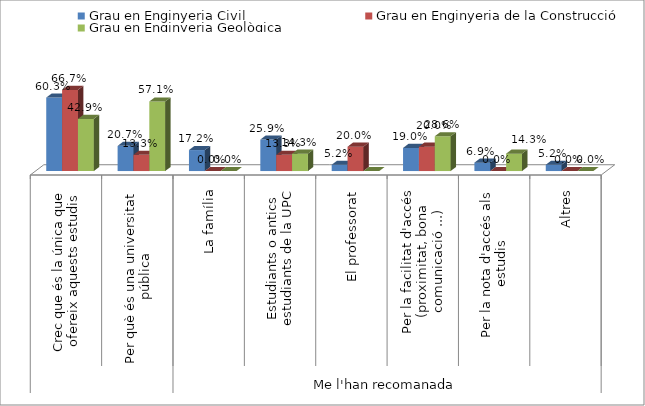
| Category | Grau en Enginyeria Civil | Grau en Enginyeria de la Construcció | Grau en Enginyeria Geològica |
|---|---|---|---|
| 0 | 0.603 | 0.667 | 0.429 |
| 1 | 0.207 | 0.133 | 0.571 |
| 2 | 0.172 | 0 | 0 |
| 3 | 0.259 | 0.133 | 0.143 |
| 4 | 0.052 | 0.2 | 0 |
| 5 | 0.19 | 0.2 | 0.286 |
| 6 | 0.069 | 0 | 0.143 |
| 7 | 0.052 | 0 | 0 |